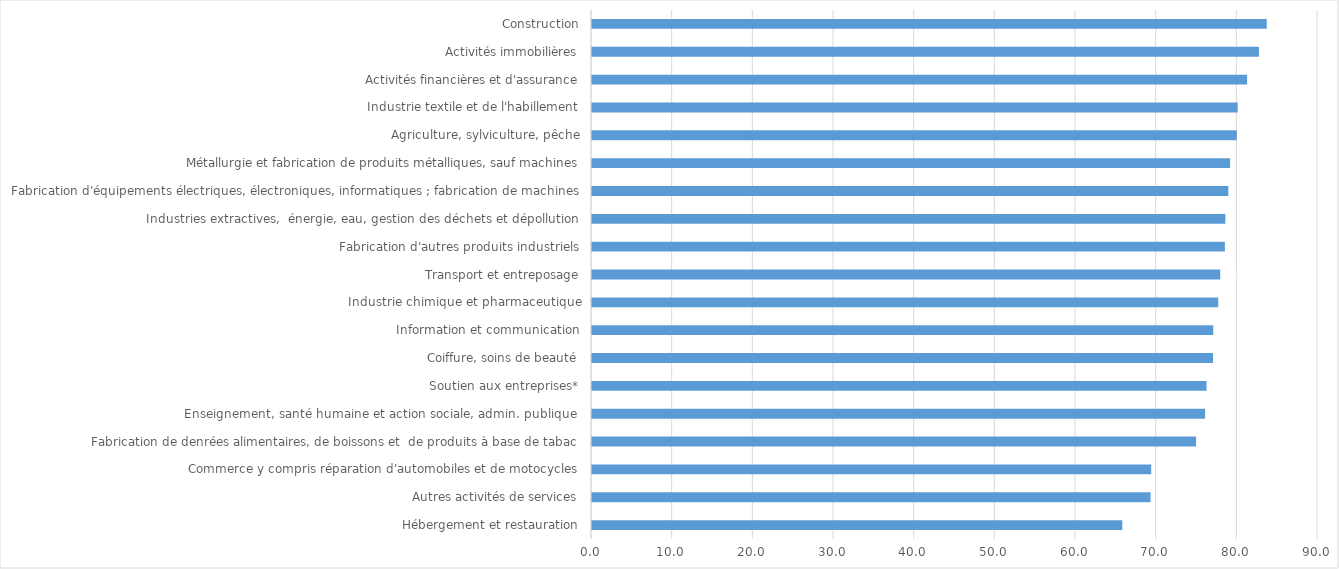
| Category | Series 0 |
|---|---|
| Hébergement et restauration | 65.744 |
| Autres activités de services | 69.244 |
| Commerce y compris réparation d'automobiles et de motocycles | 69.323 |
| Fabrication de denrées alimentaires, de boissons et  de produits à base de tabac | 74.89 |
| Enseignement, santé humaine et action sociale, admin. publique  | 76 |
| Soutien aux entreprises* | 76.182 |
| Coiffure, soins de beauté | 76.988 |
| Information et communication | 77.012 |
| Industrie chimique et pharmaceutique | 77.635 |
| Transport et entreposage | 77.878 |
| Fabrication d'autres produits industriels | 78.458 |
| Industries extractives,  énergie, eau, gestion des déchets et dépollution | 78.519 |
| Fabrication d'équipements électriques, électroniques, informatiques ; fabrication de machines | 78.883 |
| Métallurgie et fabrication de produits métalliques, sauf machines | 79.102 |
| Agriculture, sylviculture, pêche | 79.935 |
| Industrie textile et de l'habillement | 80.048 |
| Activités financières et d'assurance | 81.213 |
| Activités immobilières | 82.68 |
| Construction | 83.647 |